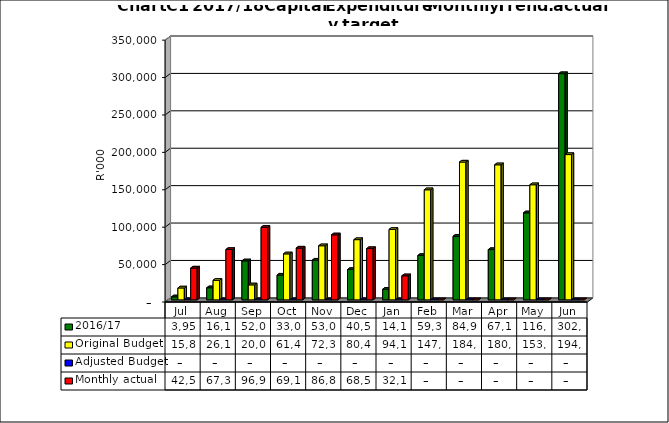
| Category | 2016/17 | Original Budget | Adjusted Budget | Monthly actual |
|---|---|---|---|---|
| Jul | 3958013.321 | 15888227.121 | 0 | 42514077.958 |
| Aug | 16119878.958 | 26147045.201 | 0 | 67305085.712 |
| Sep | 52071773.847 | 20000000 | 0 | 96927101.019 |
| Oct | 33023091.668 | 61424090.403 | 0 | 69191121.856 |
| Nov | 53074277.766 | 72300520.141 | 0 | 86835890.219 |
| Dec | 40503251.183 | 80450520.141 | 0 | 68525464.005 |
| Jan | 14140244.7 | 94117062.52 | 0 | 32153725.45 |
| Feb | 59318767.097 | 147118047.537 | 0 | 0 |
| Mar | 84955280.367 | 184167062.52 | 0 | 0 |
| Apr | 67166855.65 | 180519809.357 | 0 | 0 |
| May | 116269357.366 | 153826239.095 | 0 | 0 |
| Jun | 302312762.406 | 194159375.962 | 0 | 0 |